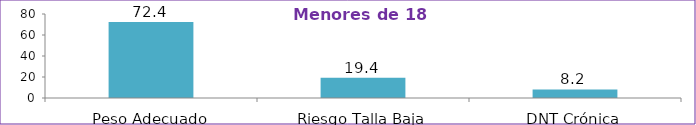
| Category | Series 0 |
|---|---|
| Peso Adecuado | 72.4 |
| Riesgo Talla Baja | 19.4 |
| DNT Crónica | 8.2 |